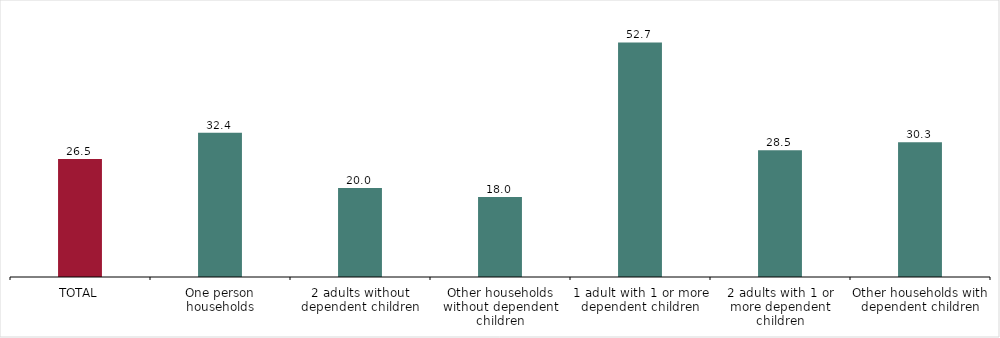
| Category | Tipo de hogar |
|---|---|
| TOTAL | 26.5 |
| One person households | 32.4 |
| 2 adults without dependent children | 20 |
| Other households without dependent children | 18 |
| 1 adult with 1 or more dependent children | 52.7 |
| 2 adults with 1 or more dependent children | 28.5 |
| Other households with dependent children | 30.3 |